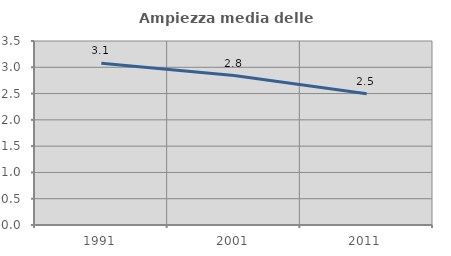
| Category | Ampiezza media delle famiglie |
|---|---|
| 1991.0 | 3.078 |
| 2001.0 | 2.844 |
| 2011.0 | 2.498 |